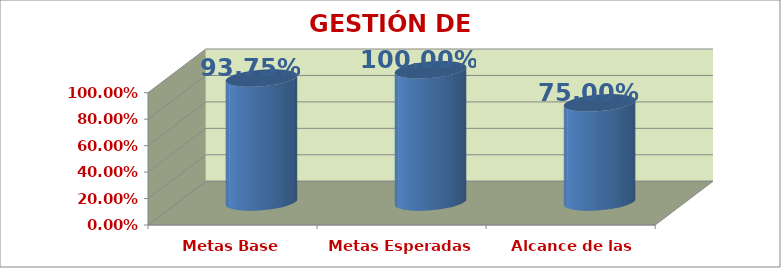
| Category | GESTIÓN DE AULA |
|---|---|
| Metas Base | 0.938 |
| Metas Esperadas | 1 |
| Alcance de las Metas | 0.75 |